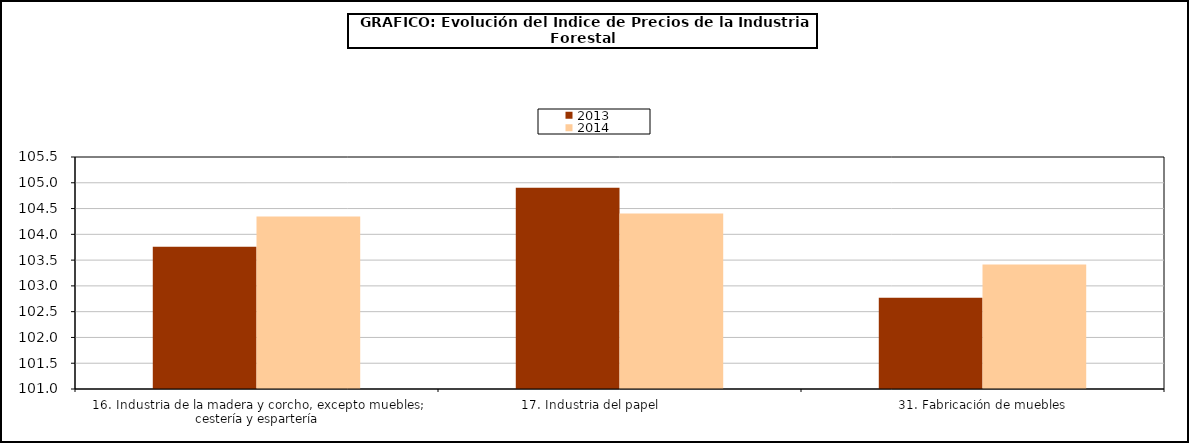
| Category | 2013 | 2014 |
|---|---|---|
| 16. Industria de la madera y corcho, excepto muebles; cestería y espartería | 103.761 | 104.344 |
| 17. Industria del papel                | 104.906 | 104.405 |
| 31. Fabricación de muebles | 102.772 | 103.415 |